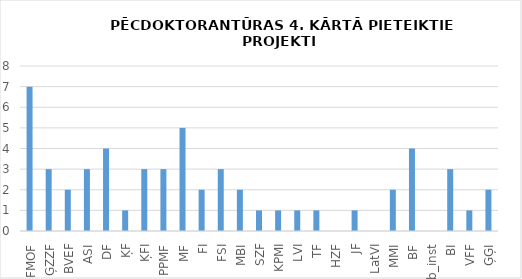
| Category | Pieteikto projektu skaits  |
|---|---|
| FMOF | 7 |
| ĢZZF | 3 |
| BVEF | 2 |
| ASI | 3 |
| DF | 4 |
| ĶF | 1 |
| ĶFI | 3 |
| PPMF | 3 |
| MF | 5 |
| FI | 2 |
| FSI | 3 |
| MBI | 2 |
| SZF | 1 |
| KPMI | 1 |
| LVI | 1 |
| TF | 1 |
| HZF | 0 |
| JF | 1 |
| LatVI | 0 |
| MMI | 2 |
| BF | 4 |
| Līb_inst | 0 |
| BI | 3 |
| VFF | 1 |
| ĢĢI | 2 |